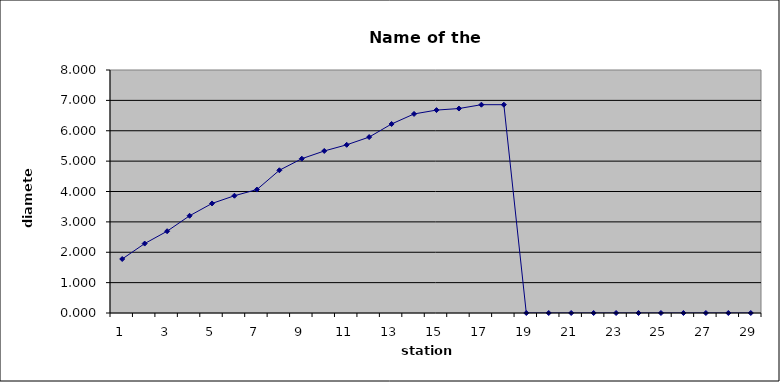
| Category | Series 0 |
|---|---|
| 0 | 1.778 |
| 1 | 2.286 |
| 2 | 2.692 |
| 3 | 3.2 |
| 4 | 3.607 |
| 5 | 3.861 |
| 6 | 4.064 |
| 7 | 4.699 |
| 8 | 5.08 |
| 9 | 5.334 |
| 10 | 5.537 |
| 11 | 5.791 |
| 12 | 6.223 |
| 13 | 6.553 |
| 14 | 6.68 |
| 15 | 6.731 |
| 16 | 6.858 |
| 17 | 6.858 |
| 18 | 0 |
| 19 | 0 |
| 20 | 0 |
| 21 | 0 |
| 22 | 0 |
| 23 | 0 |
| 24 | 0 |
| 25 | 0 |
| 26 | 0 |
| 27 | 0 |
| 28 | 0 |